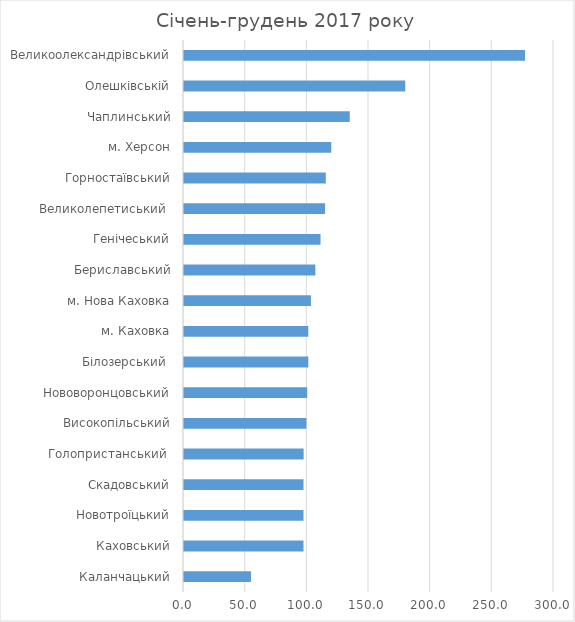
| Category | Series 0 |
|---|---|
| Каланчацький | 54.3 |
| Каховський | 96.9 |
| Новотроїцький | 96.9 |
| Скадовський | 96.9 |
| Голопристанський  | 97 |
| Високопільський | 99.2 |
| Нововоронцовський | 99.9 |
| Білозерський  | 100.8 |
| м. Каховка | 100.8 |
| м. Нова Каховка | 102.9 |
| Бериславський | 106.5 |
| Генічеський | 110.7 |
| Великолепетиський  | 114.4 |
| Горностаївський | 115 |
| м. Херсон | 119.4 |
| Чаплинський | 134.4 |
| Олешківській | 179.4 |
| Великоолександрівський | 276.5 |